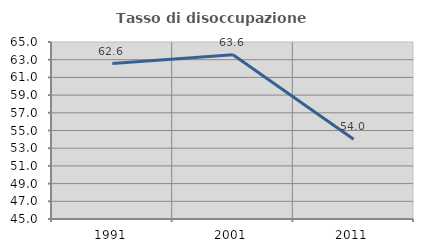
| Category | Tasso di disoccupazione giovanile  |
|---|---|
| 1991.0 | 62.559 |
| 2001.0 | 63.556 |
| 2011.0 | 54.013 |